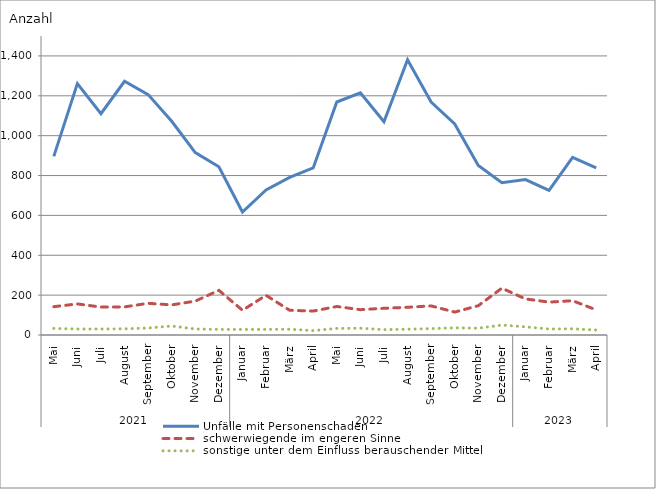
| Category | Unfälle mit Personenschaden | schwerwiegende im engeren Sinne | sonstige unter dem Einfluss berauschender Mittel |
|---|---|---|---|
| 0 | 896 | 142 | 33 |
| 1 | 1261 | 156 | 30 |
| 2 | 1110 | 140 | 30 |
| 3 | 1273 | 141 | 31 |
| 4 | 1206 | 159 | 35 |
| 5 | 1072 | 151 | 45 |
| 6 | 915 | 170 | 30 |
| 7 | 844 | 224 | 28 |
| 8 | 617 | 124 | 28 |
| 9 | 728 | 199 | 28 |
| 10 | 791 | 124 | 29 |
| 11 | 838 | 120 | 22 |
| 12 | 1169 | 143 | 33 |
| 13 | 1215 | 127 | 34 |
| 14 | 1070 | 134 | 27 |
| 15 | 1381 | 139 | 29 |
| 16 | 1169 | 146 | 32 |
| 17 | 1059 | 115 | 36 |
| 18 | 850 | 147 | 34 |
| 19 | 764 | 235 | 50 |
| 20 | 780 | 181 | 41 |
| 21 | 725 | 165 | 30 |
| 22 | 891 | 172 | 31 |
| 23 | 839 | 126 | 25 |